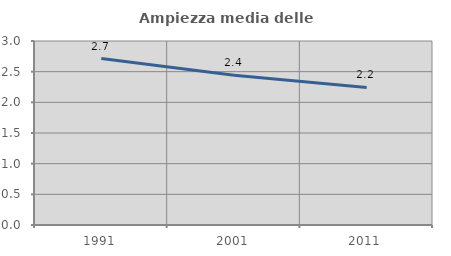
| Category | Ampiezza media delle famiglie |
|---|---|
| 1991.0 | 2.715 |
| 2001.0 | 2.44 |
| 2011.0 | 2.243 |